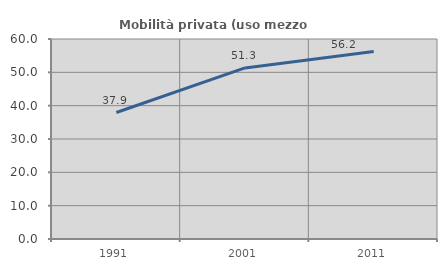
| Category | Mobilità privata (uso mezzo privato) |
|---|---|
| 1991.0 | 37.941 |
| 2001.0 | 51.332 |
| 2011.0 | 56.243 |